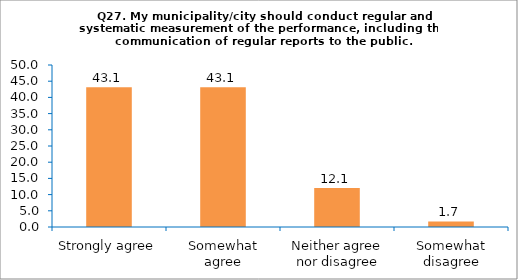
| Category | Series 0 |
|---|---|
| Strongly agree | 43.103 |
| Somewhat agree | 43.103 |
| Neither agree nor disagree | 12.069 |
| Somewhat disagree | 1.724 |